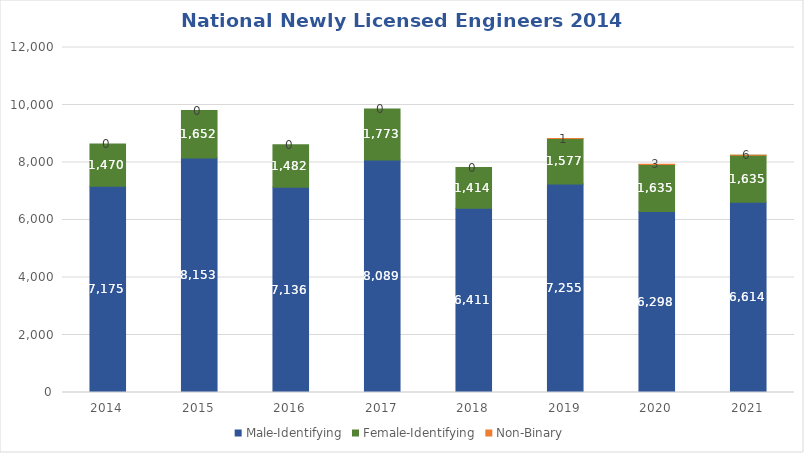
| Category | Male-Identifying | Female-Identifying | Non-Binary |
|---|---|---|---|
| 2014.0 | 7175 | 1470 | 0 |
| 2015.0 | 8153 | 1652 | 0 |
| 2016.0 | 7136 | 1482 | 0 |
| 2017.0 | 8089 | 1773 | 0 |
| 2018.0 | 6411 | 1414 | 0 |
| 2019.0 | 7255 | 1577 | 1 |
| 2020.0 | 6298 | 1635 | 3 |
| 2021.0 | 6614 | 1635 | 6 |